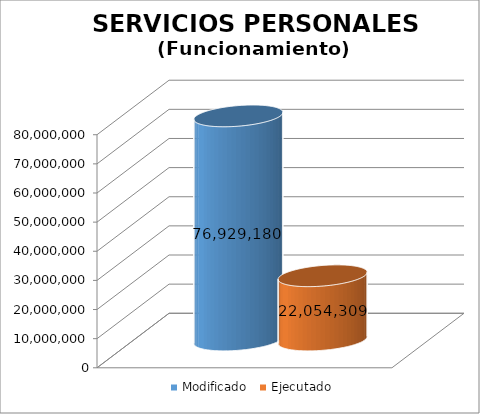
| Category | Modificado | Ejecutado |
|---|---|---|
| 0 | 76929180 | 22054309.07 |